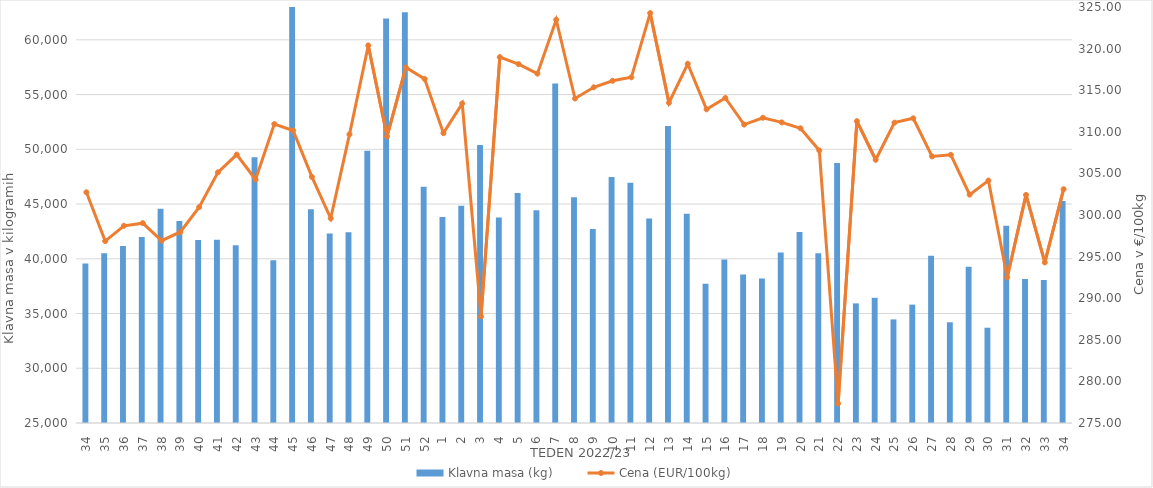
| Category | Klavna masa (kg) |
|---|---|
| 34.0 | 39563 |
| 35.0 | 40507 |
| 36.0 | 41176 |
| 37.0 | 41983 |
| 38.0 | 44572 |
| 39.0 | 43447 |
| 40.0 | 41711 |
| 41.0 | 41736 |
| 42.0 | 41239 |
| 43.0 | 49284 |
| 44.0 | 39877 |
| 45.0 | 63668 |
| 46.0 | 44528 |
| 47.0 | 42319 |
| 48.0 | 42416 |
| 49.0 | 49873 |
| 50.0 | 61942 |
| 51.0 | 62514 |
| 52.0 | 46589 |
| 1.0 | 43807 |
| 2.0 | 44834 |
| 3.0 | 50386 |
| 4.0 | 43773 |
| 5.0 | 46011 |
| 6.0 | 44439 |
| 7.0 | 56001 |
| 8.0 | 45613 |
| 9.0 | 42730 |
| 10.0 | 47471 |
| 11.0 | 46952 |
| 12.0 | 43683 |
| 13.0 | 52135 |
| 14.0 | 44103 |
| 15.0 | 37719 |
| 16.0 | 39943 |
| 17.0 | 38574 |
| 18.0 | 38200 |
| 19.0 | 40581 |
| 20.0 | 42443 |
| 21.0 | 40517 |
| 22.0 | 48742 |
| 23.0 | 35927 |
| 24.0 | 36436 |
| 25.0 | 34463 |
| 26.0 | 35812 |
| 27.0 | 40280 |
| 28.0 | 34201 |
| 29.0 | 39279 |
| 30.0 | 33702 |
| 31.0 | 43020 |
| 32.0 | 38146 |
| 33.0 | 38070 |
| 34.0 | 45290 |